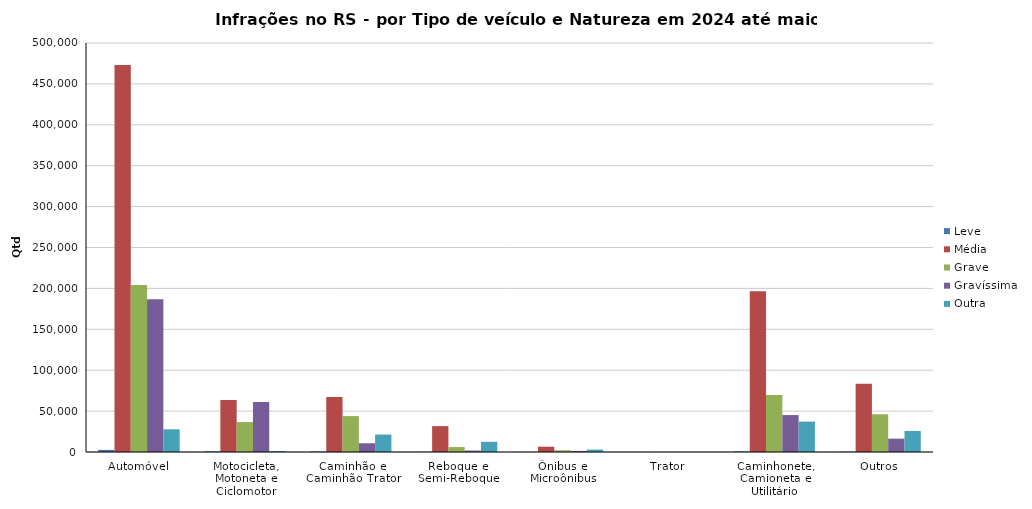
| Category | Leve | Média | Grave | Gravíssima | Outra |
|---|---|---|---|---|---|
| Automóvel | 2569 | 473197 | 204142 | 186675 | 27732 |
| Motocicleta, Motoneta e Ciclomotor | 794 | 63501 | 36577 | 61131 | 1248 |
| Caminhão e Caminhão Trator | 627 | 67365 | 43891 | 10661 | 21331 |
| Reboque e Semi-Reboque | 288 | 31650 | 6046 | 1755 | 12478 |
| Ônibus e Microônibus | 47 | 6479 | 2116 | 1300 | 2928 |
| Trator | 1 | 44 | 33 | 38 | 15 |
| Caminhonete, Camioneta e Utilitário | 657 | 196581 | 69692 | 45149 | 37173 |
| Outros | 403 | 83534 | 46151 | 16295 | 25654 |